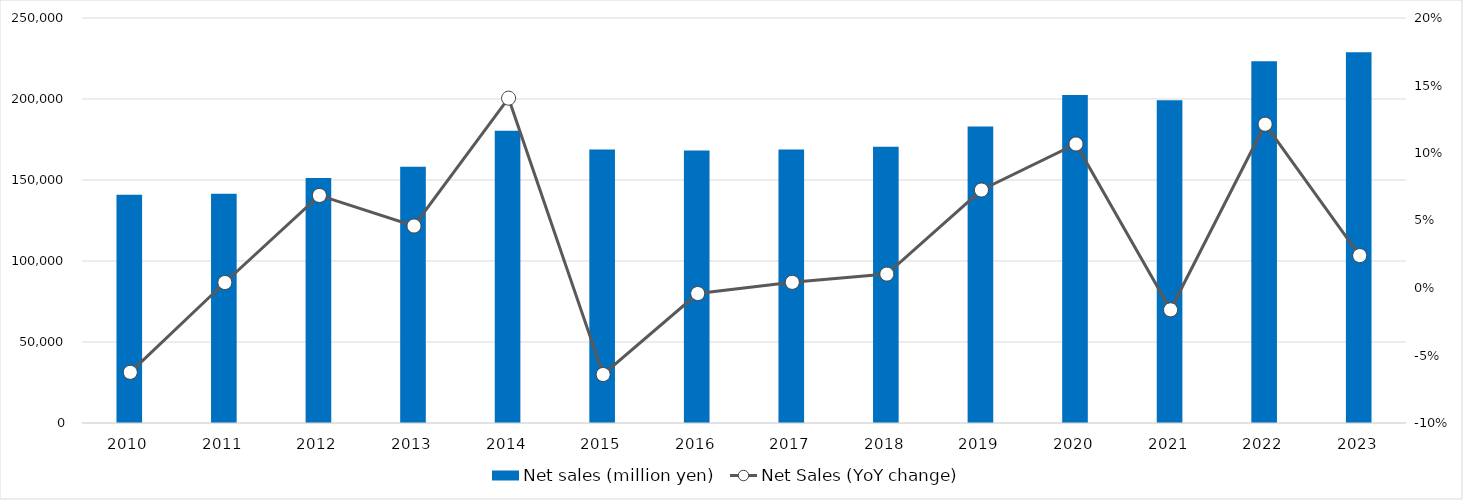
| Category | Net sales (million yen) |
|---|---|
| 2010 | 140936 |
| 2011 | 141506 |
| 2012 | 151209 |
| 2013 | 158153 |
| 2014 | 180392 |
| 2015 | 168833 |
| 2016 | 168141 |
| 2017 | 168841 |
| 2018 | 170581 |
| 2019 | 182962 |
| 2020 | 202481 |
| 2021 | 199210 |
| 2022 | 223377 |
| 2023 | 228826 |